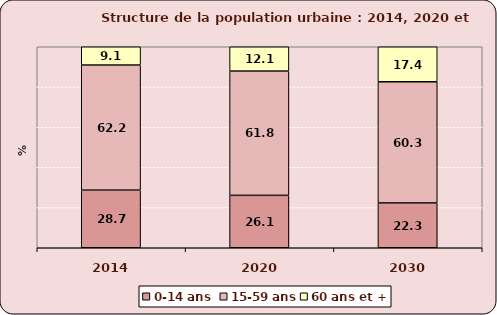
| Category | 0-14 ans  | 15-59 ans | 60 ans et + |
|---|---|---|---|
| 2014.0 | 28.656 | 62.249 | 9.096 |
| 2020.0 | 26.068 | 61.83 | 12.101 |
| 2030.0 | 22.291 | 60.289 | 17.421 |